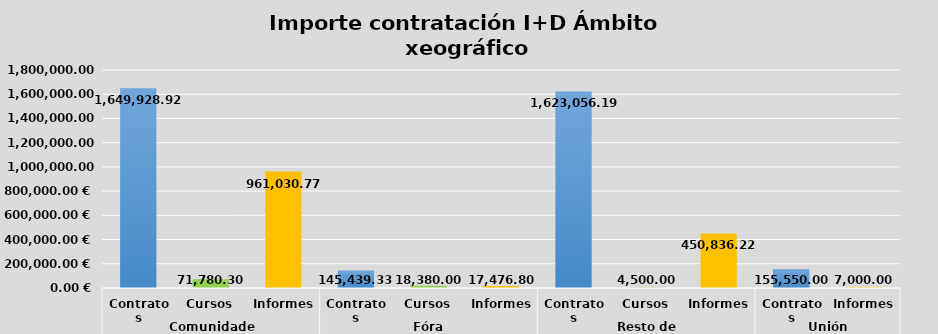
| Category | Series 0 |
|---|---|
| 0 | 1649928.92 |
| 1 | 71780.3 |
| 2 | 961030.77 |
| 3 | 145439.33 |
| 4 | 18380 |
| 5 | 17476.8 |
| 6 | 1623056.19 |
| 7 | 4500 |
| 8 | 450836.22 |
| 9 | 155550 |
| 10 | 7000 |